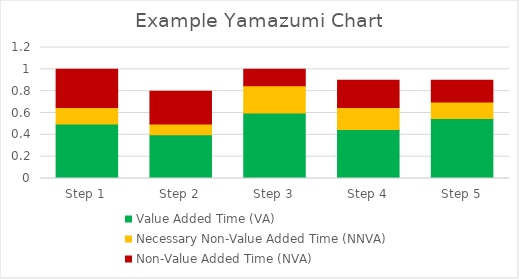
| Category | Value Added Time (VA) | Necessary Non-Value Added Time (NNVA) | Non-Value Added Time (NVA) |
|---|---|---|---|
| Step 1 | 0.5 | 0.15 | 0.35 |
| Step 2 | 0.4 | 0.1 | 0.3 |
| Step 3 | 0.6 | 0.25 | 0.15 |
| Step 4 | 0.45 | 0.2 | 0.25 |
| Step 5 | 0.55 | 0.15 | 0.2 |